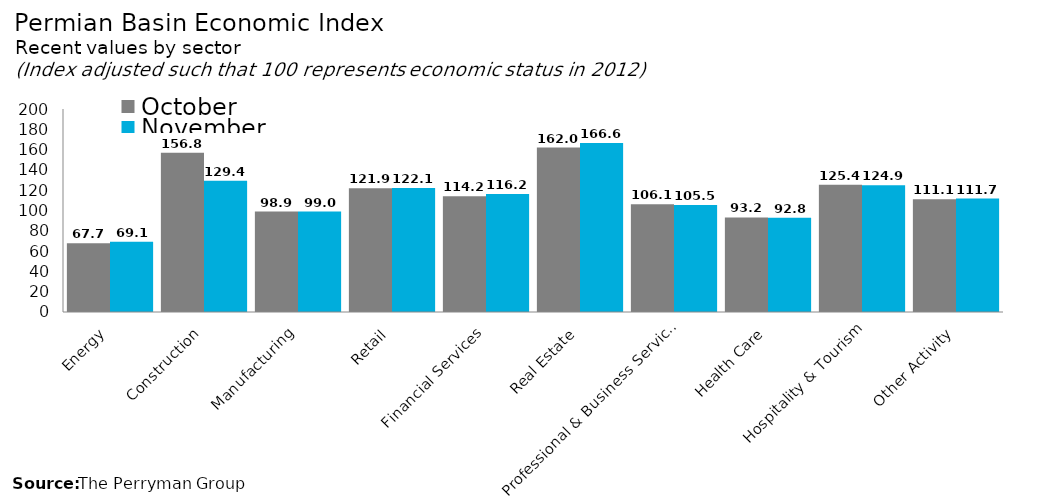
| Category | October | November |
|---|---|---|
| Energy | 67.737 | 69.149 |
| Construction | 156.785 | 129.41 |
| Manufacturing | 98.91 | 98.989 |
| Retail | 121.887 | 122.124 |
| Financial Services | 114.158 | 116.226 |
| Real Estate | 161.976 | 166.597 |
| Professional & Business Services | 106.149 | 105.47 |
| Health Care | 93.158 | 92.773 |
| Hospitality & Tourism | 125.406 | 124.863 |
| Other Activity | 111.141 | 111.733 |